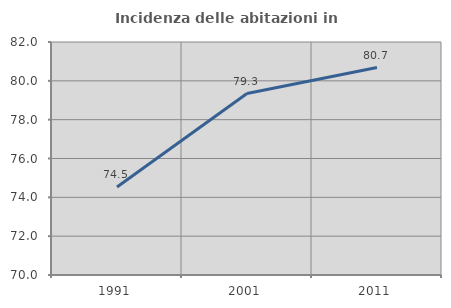
| Category | Incidenza delle abitazioni in proprietà  |
|---|---|
| 1991.0 | 74.532 |
| 2001.0 | 79.344 |
| 2011.0 | 80.685 |